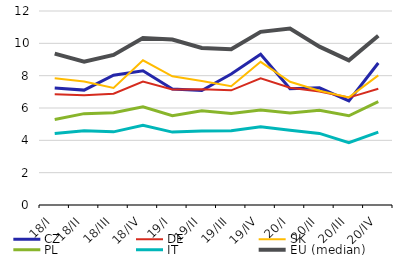
| Category | CZ | DE | SK | PL | IT | EU (median) |
|---|---|---|---|---|---|---|
| 18/I | 7.237 | 6.853 | 7.844 | 5.295 | 4.425 | 9.361 |
| 18/II | 7.107 | 6.795 | 7.632 | 5.651 | 4.598 | 8.862 |
| 18/III | 8.03 | 6.883 | 7.246 | 5.705 | 4.524 | 9.284 |
| 18/IV | 8.307 | 7.64 | 8.949 | 6.075 | 4.93 | 10.332 |
| 19/I | 7.177 | 7.142 | 7.96 | 5.522 | 4.509 | 10.232 |
| 19/II | 7.085 | 7.154 | 7.664 | 5.834 | 4.572 | 9.714 |
| 19/III | 8.107 | 7.092 | 7.342 | 5.664 | 4.595 | 9.636 |
| 19/IV | 9.318 | 7.836 | 8.856 | 5.877 | 4.839 | 10.709 |
| 20/I | 7.197 | 7.252 | 7.62 | 5.685 | 4.625 | 10.911 |
| 20/II | 7.249 | 7.015 | 7.067 | 5.854 | 4.43 | 9.793 |
| 20/III | 6.434 | 6.644 | 6.655 | 5.521 | 3.861 | 8.944 |
| 20/IV | 8.784 | 7.195 | 8.015 | 6.388 | 4.507 | 10.465 |